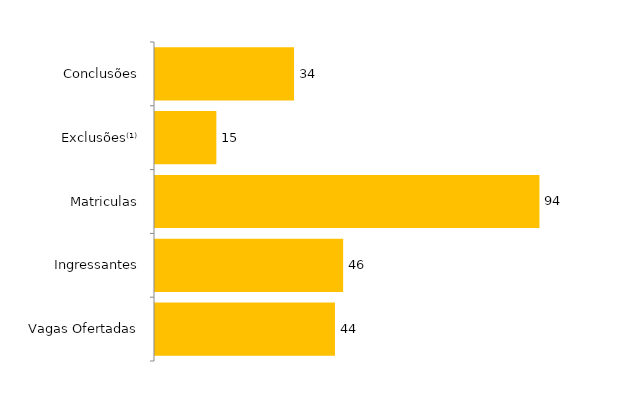
| Category | Total (2020) |
|---|---|
| Vagas Ofertadas | 44 |
| Ingressantes | 46 |
| Matriculas | 94 |
| Exclusões⁽¹⁾ | 15 |
| Conclusões | 34 |